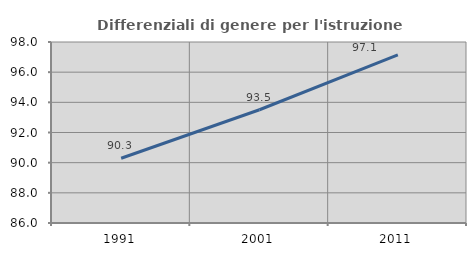
| Category | Differenziali di genere per l'istruzione superiore |
|---|---|
| 1991.0 | 90.294 |
| 2001.0 | 93.508 |
| 2011.0 | 97.14 |